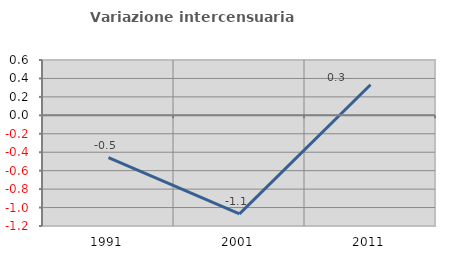
| Category | Variazione intercensuaria annua |
|---|---|
| 1991.0 | -0.458 |
| 2001.0 | -1.069 |
| 2011.0 | 0.331 |